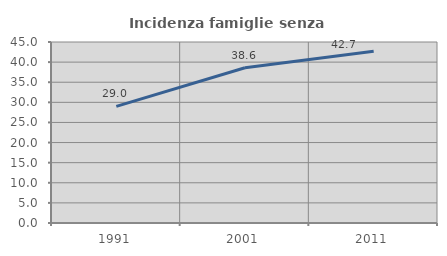
| Category | Incidenza famiglie senza nuclei |
|---|---|
| 1991.0 | 29.002 |
| 2001.0 | 38.596 |
| 2011.0 | 42.705 |